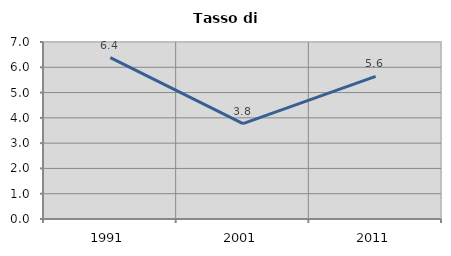
| Category | Tasso di disoccupazione   |
|---|---|
| 1991.0 | 6.384 |
| 2001.0 | 3.771 |
| 2011.0 | 5.64 |